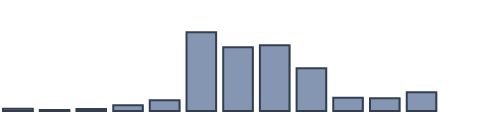
| Category | Series 0 |
|---|---|
| 0 | 0.719 |
| 1 | 0.311 |
| 2 | 0.629 |
| 3 | 1.786 |
| 4 | 3.365 |
| 5 | 24.812 |
| 6 | 20.114 |
| 7 | 20.708 |
| 8 | 13.454 |
| 9 | 4.161 |
| 10 | 4.038 |
| 11 | 5.905 |
| 12 | 0 |